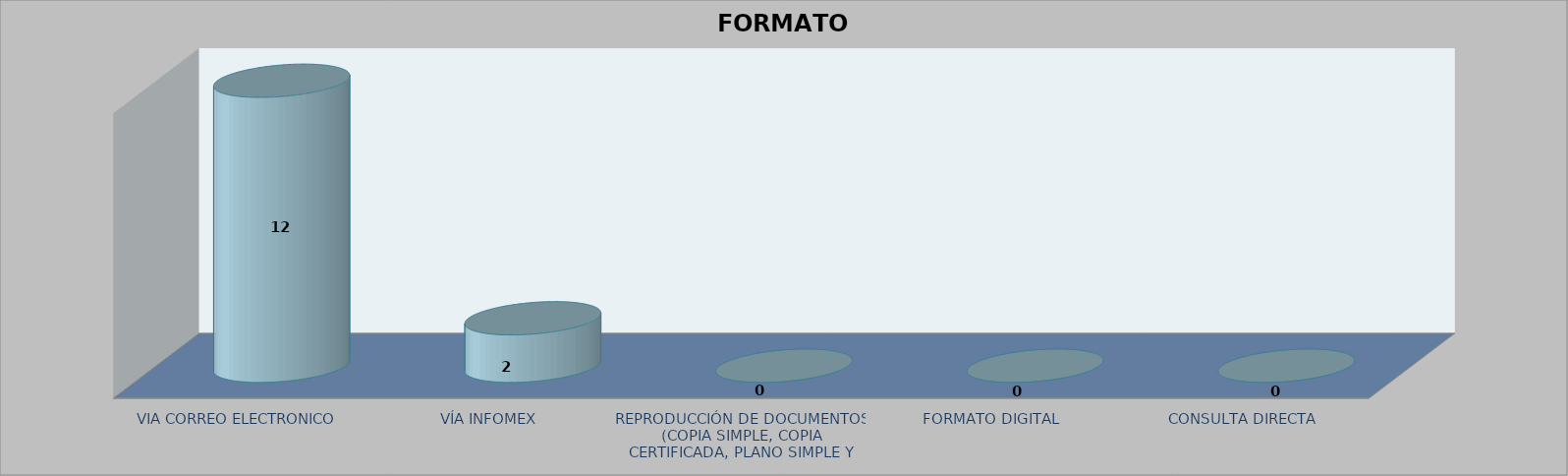
| Category |        FORMATO SOLICITADO | Series 1 | Series 2 |
|---|---|---|---|
| VIA CORREO ELECTRONICO |  |  | 12 |
| VÍA INFOMEX |  |  | 2 |
| REPRODUCCIÓN DE DOCUMENTOS (COPIA SIMPLE, COPIA CERTIFICADA, PLANO SIMPLE Y PLANO CERTIFICADO) |  |  | 0 |
| FORMATO DIGITAL |  |  | 0 |
| CONSULTA DIRECTA |  |  | 0 |